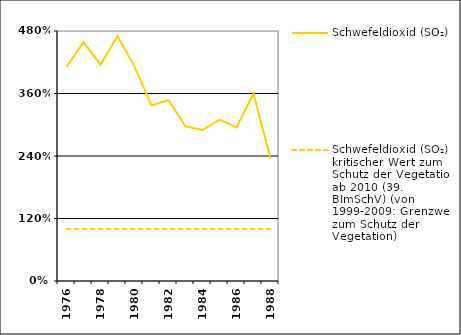
| Category | Schwefeldioxid (SO₂) | Schwefeldioxid (SO₂) kritischer Wert zum Schutz der Vegetation ab 2010 (39. BImSchV) (von 1999-2009: Grenzwert zum Schutz der Vegetation) |
|---|---|---|
| 1976.0 | 4.108 | 1 |
| 1977.0 | 4.588 | 1 |
| 1978.0 | 4.154 | 1 |
| 1979.0 | 4.7 | 1 |
| 1980.0 | 4.121 | 1 |
| 1981.0 | 3.375 | 1 |
| 1982.0 | 3.471 | 1 |
| 1983.0 | 2.971 | 1 |
| 1984.0 | 2.9 | 1 |
| 1985.0 | 3.1 | 1 |
| 1986.0 | 2.95 | 1 |
| 1987.0 | 3.6 | 1 |
| 1988.0 | 2.35 | 1 |